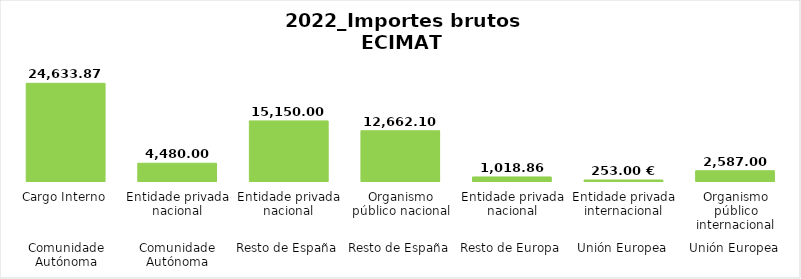
| Category | Series 0 |
|---|---|
| 0 | 24633.87 |
| 1 | 4480 |
| 2 | 15150 |
| 3 | 12662.1 |
| 4 | 1018.86 |
| 5 | 253 |
| 6 | 2587 |